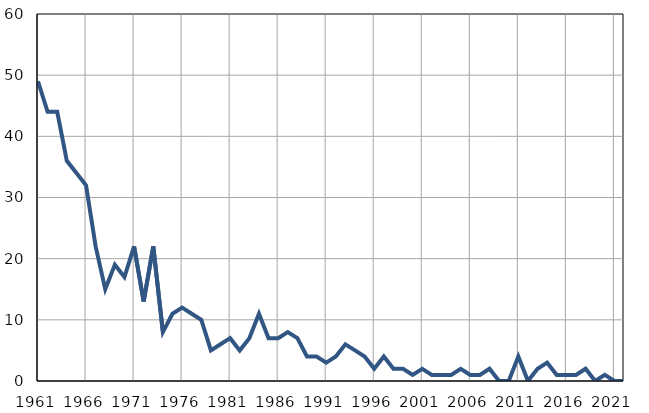
| Category | Infants
deaths |
|---|---|
| 1961.0 | 49 |
| 1962.0 | 44 |
| 1963.0 | 44 |
| 1964.0 | 36 |
| 1965.0 | 34 |
| 1966.0 | 32 |
| 1967.0 | 22 |
| 1968.0 | 15 |
| 1969.0 | 19 |
| 1970.0 | 17 |
| 1971.0 | 22 |
| 1972.0 | 13 |
| 1973.0 | 22 |
| 1974.0 | 8 |
| 1975.0 | 11 |
| 1976.0 | 12 |
| 1977.0 | 11 |
| 1978.0 | 10 |
| 1979.0 | 5 |
| 1980.0 | 6 |
| 1981.0 | 7 |
| 1982.0 | 5 |
| 1983.0 | 7 |
| 1984.0 | 11 |
| 1985.0 | 7 |
| 1986.0 | 7 |
| 1987.0 | 8 |
| 1988.0 | 7 |
| 1989.0 | 4 |
| 1990.0 | 4 |
| 1991.0 | 3 |
| 1992.0 | 4 |
| 1993.0 | 6 |
| 1994.0 | 5 |
| 1995.0 | 4 |
| 1996.0 | 2 |
| 1997.0 | 4 |
| 1998.0 | 2 |
| 1999.0 | 2 |
| 2000.0 | 1 |
| 2001.0 | 2 |
| 2002.0 | 1 |
| 2003.0 | 1 |
| 2004.0 | 1 |
| 2005.0 | 2 |
| 2006.0 | 1 |
| 2007.0 | 1 |
| 2008.0 | 2 |
| 2009.0 | 0 |
| 2010.0 | 0 |
| 2011.0 | 4 |
| 2012.0 | 0 |
| 2013.0 | 2 |
| 2014.0 | 3 |
| 2015.0 | 1 |
| 2016.0 | 1 |
| 2017.0 | 1 |
| 2018.0 | 2 |
| 2019.0 | 0 |
| 2020.0 | 1 |
| 2021.0 | 0 |
| 2022.0 | 0 |